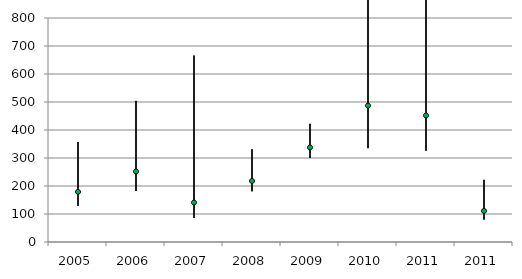
| Category | Верх. граница | Нижн. граница | Среднее |
|---|---|---|---|
| 2005.0 | 357 | 129 | 179 |
| 2006.0 | 504 | 182 | 252 |
| 2007.0 | 666 | 86 | 141 |
| 2008.0 | 331 | 181 | 218 |
| 2009.0 | 422 | 300 | 338 |
| 2010.0 | 1216 | 335 | 487 |
| 2011.0 | 903 | 326 | 452 |
| 2011.0 | 222 | 80 | 111 |